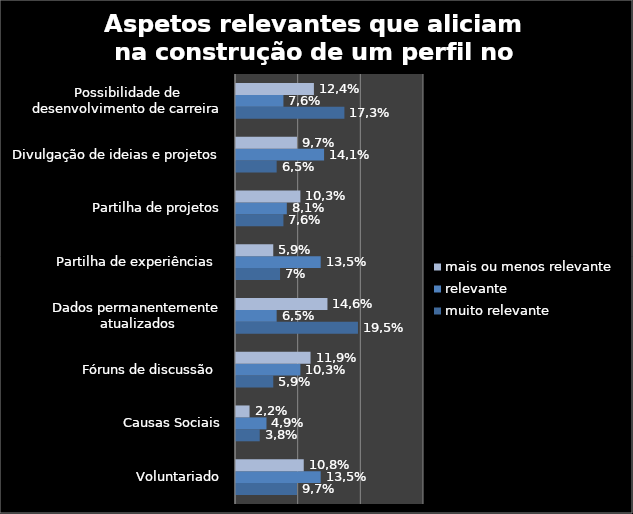
| Category | muito relevante | relevante | mais ou menos relevante |
|---|---|---|---|
| Voluntariado | 9.73 | 13.514 | 10.811 |
| Causas Sociais | 3.784 | 4.865 | 2.162 |
| Fóruns de discussão  | 5.946 | 10.27 | 11.892 |
| Dados permanentemente atualizados | 19.459 | 6.486 | 14.595 |
| Partilha de experiências  | 7.027 | 13.514 | 5.946 |
| Partilha de projetos | 7.568 | 8.108 | 10.27 |
| Divulgação de ideias e projetos | 6.486 | 14.054 | 9.73 |
| Possibilidade de desenvolvimento de carreira | 17.297 | 7.568 | 12.432 |